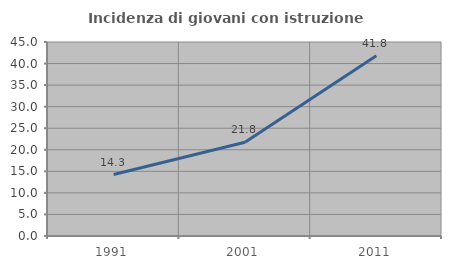
| Category | Incidenza di giovani con istruzione universitaria |
|---|---|
| 1991.0 | 14.26 |
| 2001.0 | 21.752 |
| 2011.0 | 41.83 |